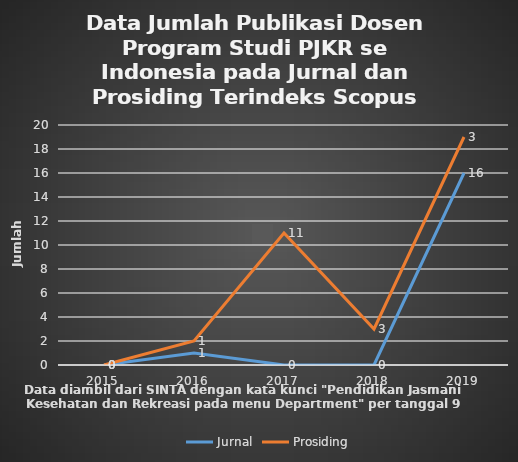
| Category | Jurnal | Prosiding |
|---|---|---|
| 2015.0 | 0 | 0 |
| 2016.0 | 1 | 1 |
| 2017.0 | 0 | 11 |
| 2018.0 | 0 | 3 |
| 2019.0 | 16 | 3 |